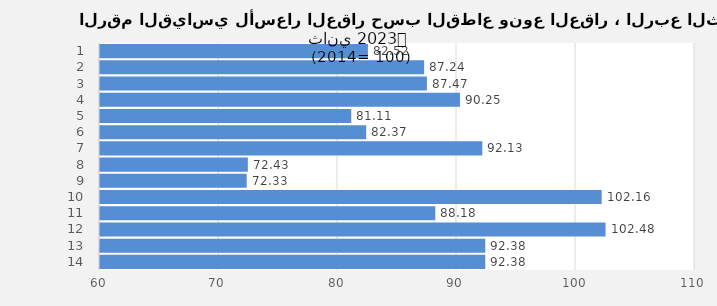
| Category | 2023 |
|---|---|
| 0 | 82.516 |
| 1 | 87.24 |
| 2 | 87.472 |
| 3 | 90.25 |
| 4 | 81.114 |
| 5 | 82.369 |
| 6 | 92.127 |
| 7 | 72.425 |
| 8 | 72.33 |
| 9 | 102.156 |
| 10 | 88.177 |
| 11 | 102.482 |
| 12 | 92.376 |
| 13 | 92.376 |